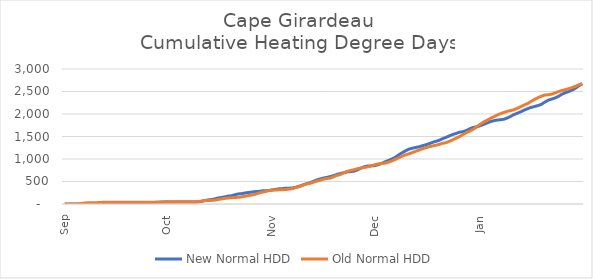
| Category | New Normal HDD | Old Normal HDD |
|---|---|---|
|  Sep  | 0 | 0 |
|  | 0 | 0 |
|  | 0 | 0 |
|  | 0 | 0 |
|  | 0 | 2.69 |
|  | 0 | 11.597 |
|  | 0 | 24.239 |
|  | 0 | 25.966 |
|  | 6.71 | 25.966 |
|  | 6.924 | 26.18 |
|  | 6.924 | 32.89 |
|  | 7.816 | 36.409 |
|  | 7.816 | 36.409 |
|  | 7.816 | 36.409 |
|  | 7.816 | 36.409 |
|  | 7.816 | 36.409 |
|  | 7.816 | 36.409 |
|  | 7.816 | 36.409 |
|  | 7.816 | 36.409 |
|  | 7.816 | 36.409 |
|  | 7.816 | 36.409 |
|  | 12.982 | 36.409 |
|  | 15.672 | 36.409 |
|  | 15.672 | 36.409 |
|  | 15.672 | 36.409 |
|  | 17.399 | 36.409 |
|  | 30.041 | 36.409 |
|  | 38.948 | 36.409 |
|  | 42.467 | 37.301 |
|  | 42.467 | 42.467 |
|  Oct  | 44.051 | 48.409 |
|  | 44.728 | 49.993 |
|  | 44.728 | 49.993 |
|  | 44.732 | 49.993 |
|  | 44.732 | 49.993 |
|  | 44.732 | 49.993 |
|  | 44.732 | 49.993 |
|  | 44.732 | 50.67 |
|  | 44.732 | 50.67 |
|  | 47.235 | 53.173 |
|  | 55.523 | 62.885 |
|  | 74.866 | 73.499 |
|  | 90.029 | 78.579 |
|  | 97.736 | 78.583 |
|  | 111.774 | 85.504 |
|  | 132.347 | 98.534 |
|  | 144.573 | 112.573 |
|  | 157.604 | 124.799 |
|  | 175.608 | 132.506 |
|  | 182.529 | 140.794 |
|  | 207.001 | 144.217 |
|  | 223.959 | 148.544 |
|  | 229.9 | 157.405 |
|  | 245.942 | 172.567 |
|  | 256.555 | 188.608 |
|  | 265.415 | 199.909 |
|  | 275.127 | 217.914 |
|  | 280.207 | 242.386 |
|  | 291.508 | 261.729 |
|  | 294.932 | 278.686 |
|  | 299.259 | 299.259 |
|  Nov  | 313.022 | 309.601 |
|  | 324.621 | 309.677 |
|  | 337.217 | 315.869 |
|  | 341.416 | 317.808 |
|  | 351.758 | 322.007 |
|  | 351.834 | 331.047 |
|  | 358.026 | 345.782 |
|  | 375.262 | 368.914 |
|  | 398.394 | 388.707 |
|  | 425.454 | 418.181 |
|  | 449.561 | 445.241 |
|  | 471.248 | 457.837 |
|  | 502.343 | 481.944 |
|  | 531.817 | 508.058 |
|  | 556.744 | 525.953 |
|  | 576.538 | 550.881 |
|  | 591.273 | 567.171 |
|  | 610.084 | 575.037 |
|  | 632.444 | 608.241 |
|  | 658.559 | 636.362 |
|  | 679.359 | 657.162 |
|  | 695.649 | 695.07 |
|  | 713.544 | 726.165 |
|  | 721.41 | 744.976 |
|  | 730.451 | 762.212 |
|  | 758.572 | 784.573 |
|  | 796.479 | 800.044 |
|  | 829.683 | 811.643 |
|  | 845.155 | 825.407 |
|  | 847.094 | 847.094 |
|  Dec  | 852.285 | 872.071 |
|  | 871.258 | 891.044 |
|  | 899.704 | 901.878 |
|  | 934.084 | 907.069 |
|  | 964.579 | 928.385 |
|  | 997.755 | 954.691 |
|  | 1033.381 | 987.867 |
|  | 1087.699 | 1026.342 |
|  | 1134.089 | 1058.504 |
|  | 1176.846 | 1089 |
|  | 1217.402 | 1112.139 |
|  | 1237.706 | 1141.281 |
|  | 1254.971 | 1169.726 |
|  | 1270.662 | 1197.427 |
|  | 1293.802 | 1224.485 |
|  | 1315.118 | 1250.066 |
|  | 1340.698 | 1272.221 |
|  | 1368.399 | 1289.485 |
|  | 1393.376 | 1305.177 |
|  | 1415.531 | 1325.481 |
|  | 1452.502 | 1349.687 |
|  | 1482.331 | 1363.714 |
|  | 1514.493 | 1393.543 |
|  | 1545.686 | 1427.923 |
|  | 1569.891 | 1463.549 |
|  | 1596.95 | 1500.52 |
|  | 1607.784 | 1546.91 |
|  | 1634.09 | 1589.666 |
|  | 1672.565 | 1620.859 |
|  | 1701.706 | 1661.416 |
|  | 1715.734 | 1715.734 |
|  Jan  | 1738.802 | 1771.64 |